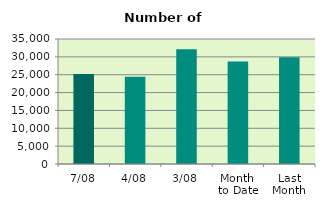
| Category | Series 0 |
|---|---|
| 7/08 | 25200 |
| 4/08 | 24444 |
| 3/08 | 32124 |
| Month 
to Date | 28708.4 |
| Last
Month | 29864.476 |